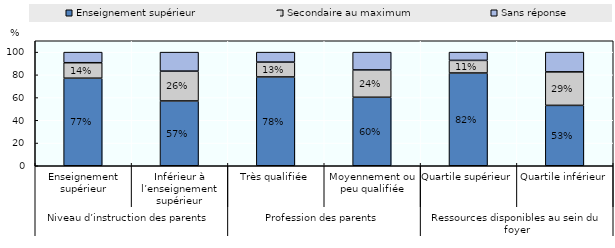
| Category | Enseignement supérieur | Secondaire au maximum | Sans réponse |
|---|---|---|---|
| 0 | 77.045 | 13.633 | 9.322 |
| 1 | 57.034 | 26.259 | 16.707 |
| 2 | 78.142 | 13.078 | 8.78 |
| 3 | 60.27 | 24.05 | 15.679 |
| 4 | 81.624 | 11.095 | 7.282 |
| 5 | 53.14 | 29.493 | 17.367 |